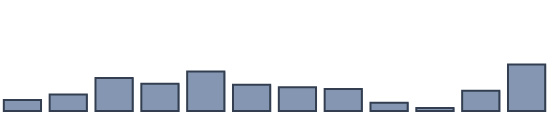
| Category | Series 0 |
|---|---|
| 0 | 4 |
| 1 | 5.957 |
| 2 | 11.913 |
| 3 | 9.826 |
| 4 | 14.217 |
| 5 | 9.478 |
| 6 | 8.522 |
| 7 | 7.957 |
| 8 | 3 |
| 9 | 1.087 |
| 10 | 7.304 |
| 11 | 16.739 |